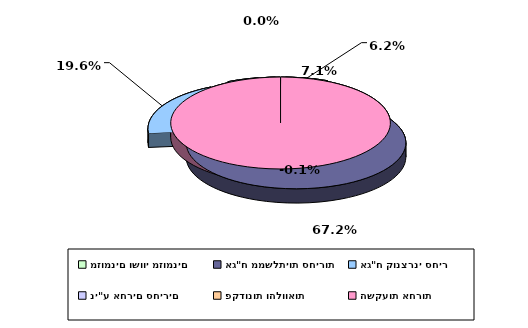
| Category | Series 0 |
|---|---|
| מזומנים ושווי מזומנים | 0.062 |
| אג"ח ממשלתיות סחירות | 0.672 |
| אג"ח קונצרני סחיר | 0.196 |
| ני"ע אחרים סחירים | 0.071 |
| פקדונות והלוואות | 0 |
| השקעות אחרות | -0.001 |